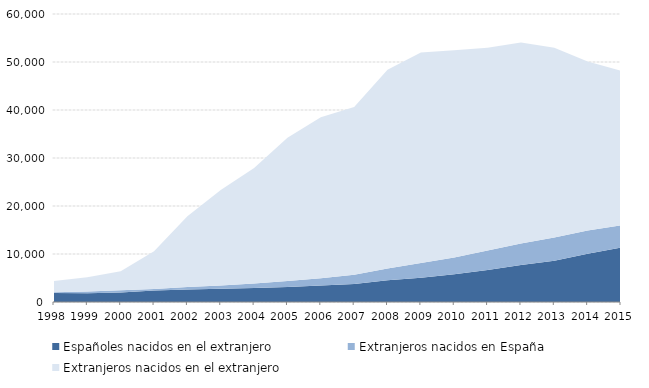
| Category | Españoles nacidos en el extranjero | Extranjeros nacidos en España | Extranjeros nacidos en el extranjero |
|---|---|---|---|
| 1998.0 | 1860 | 156 | 2383 |
| 1999.0 | 1825 | 349 | 2971 |
| 2000.0 | 1998 | 445 | 3952 |
| 2001.0 | 2392 | 340 | 7853 |
| 2002.0 | 2584 | 535 | 14753 |
| 2003.0 | 2753 | 699 | 19871 |
| 2004.0 | 2933 | 927 | 24061 |
| 2005.0 | 3141 | 1230 | 29845 |
| 2006.0 | 3429 | 1504 | 33533 |
| 2007.0 | 3774 | 1881 | 34944 |
| 2008.0 | 4515 | 2476 | 41380 |
| 2009.0 | 5063 | 3073 | 43858 |
| 2010.0 | 5769 | 3524 | 43156 |
| 2011.0 | 6663 | 4046 | 42242 |
| 2012.0 | 7695 | 4471 | 41902 |
| 2013.0 | 8571 | 4876 | 39528 |
| 2014.0 | 10074 | 4814 | 35204 |
| 2015.0 | 11340 | 4644 | 32172 |